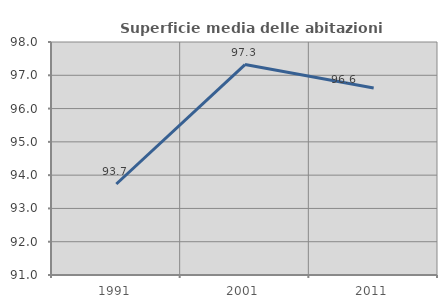
| Category | Superficie media delle abitazioni occupate |
|---|---|
| 1991.0 | 93.733 |
| 2001.0 | 97.323 |
| 2011.0 | 96.618 |